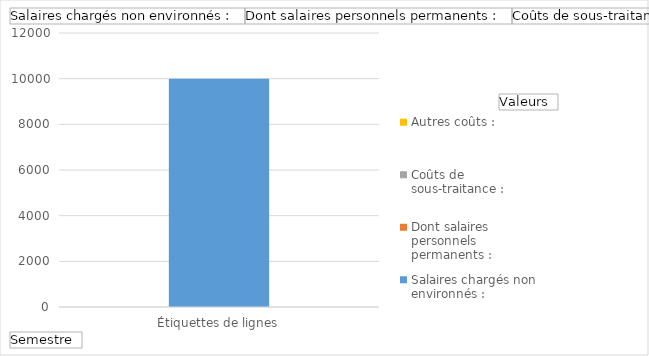
| Category | Salaires chargés non environnés : | Dont salaires personnels permanents : | Coûts de sous-traitance : | Autres coûts : |
|---|---|---|---|---|
| SEM01 | 10000 |  | 0 | 0 |
| SEM02 | 18000 |  | 0 | 0 |
| (vide) | 0 |  | 0 | 0 |